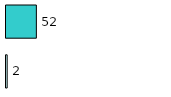
| Category | Series 0 | Series 1 |
|---|---|---|
| 0 | 2 | 52 |